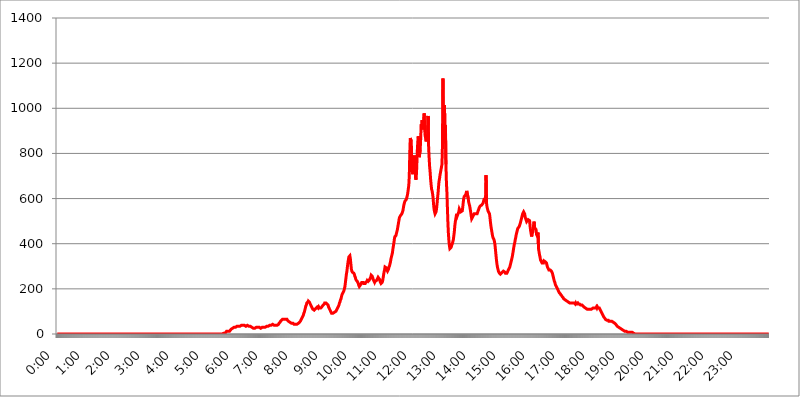
| Category | 2015.04.28. Intenzitás [W/m^2] |
|---|---|
| 0.0 | 0 |
| 0.0006944444444444445 | 0 |
| 0.001388888888888889 | 0 |
| 0.0020833333333333333 | 0 |
| 0.002777777777777778 | 0 |
| 0.003472222222222222 | 0 |
| 0.004166666666666667 | 0 |
| 0.004861111111111111 | 0 |
| 0.005555555555555556 | 0 |
| 0.0062499999999999995 | 0 |
| 0.006944444444444444 | 0 |
| 0.007638888888888889 | 0 |
| 0.008333333333333333 | 0 |
| 0.009027777777777779 | 0 |
| 0.009722222222222222 | 0 |
| 0.010416666666666666 | 0 |
| 0.011111111111111112 | 0 |
| 0.011805555555555555 | 0 |
| 0.012499999999999999 | 0 |
| 0.013194444444444444 | 0 |
| 0.013888888888888888 | 0 |
| 0.014583333333333332 | 0 |
| 0.015277777777777777 | 0 |
| 0.015972222222222224 | 0 |
| 0.016666666666666666 | 0 |
| 0.017361111111111112 | 0 |
| 0.018055555555555557 | 0 |
| 0.01875 | 0 |
| 0.019444444444444445 | 0 |
| 0.02013888888888889 | 0 |
| 0.020833333333333332 | 0 |
| 0.02152777777777778 | 0 |
| 0.022222222222222223 | 0 |
| 0.02291666666666667 | 0 |
| 0.02361111111111111 | 0 |
| 0.024305555555555556 | 0 |
| 0.024999999999999998 | 0 |
| 0.025694444444444447 | 0 |
| 0.02638888888888889 | 0 |
| 0.027083333333333334 | 0 |
| 0.027777777777777776 | 0 |
| 0.02847222222222222 | 0 |
| 0.029166666666666664 | 0 |
| 0.029861111111111113 | 0 |
| 0.030555555555555555 | 0 |
| 0.03125 | 0 |
| 0.03194444444444445 | 0 |
| 0.03263888888888889 | 0 |
| 0.03333333333333333 | 0 |
| 0.034027777777777775 | 0 |
| 0.034722222222222224 | 0 |
| 0.035416666666666666 | 0 |
| 0.036111111111111115 | 0 |
| 0.03680555555555556 | 0 |
| 0.0375 | 0 |
| 0.03819444444444444 | 0 |
| 0.03888888888888889 | 0 |
| 0.03958333333333333 | 0 |
| 0.04027777777777778 | 0 |
| 0.04097222222222222 | 0 |
| 0.041666666666666664 | 0 |
| 0.042361111111111106 | 0 |
| 0.04305555555555556 | 0 |
| 0.043750000000000004 | 0 |
| 0.044444444444444446 | 0 |
| 0.04513888888888889 | 0 |
| 0.04583333333333334 | 0 |
| 0.04652777777777778 | 0 |
| 0.04722222222222222 | 0 |
| 0.04791666666666666 | 0 |
| 0.04861111111111111 | 0 |
| 0.049305555555555554 | 0 |
| 0.049999999999999996 | 0 |
| 0.05069444444444445 | 0 |
| 0.051388888888888894 | 0 |
| 0.052083333333333336 | 0 |
| 0.05277777777777778 | 0 |
| 0.05347222222222222 | 0 |
| 0.05416666666666667 | 0 |
| 0.05486111111111111 | 0 |
| 0.05555555555555555 | 0 |
| 0.05625 | 0 |
| 0.05694444444444444 | 0 |
| 0.057638888888888885 | 0 |
| 0.05833333333333333 | 0 |
| 0.05902777777777778 | 0 |
| 0.059722222222222225 | 0 |
| 0.06041666666666667 | 0 |
| 0.061111111111111116 | 0 |
| 0.06180555555555556 | 0 |
| 0.0625 | 0 |
| 0.06319444444444444 | 0 |
| 0.06388888888888888 | 0 |
| 0.06458333333333334 | 0 |
| 0.06527777777777778 | 0 |
| 0.06597222222222222 | 0 |
| 0.06666666666666667 | 0 |
| 0.06736111111111111 | 0 |
| 0.06805555555555555 | 0 |
| 0.06874999999999999 | 0 |
| 0.06944444444444443 | 0 |
| 0.07013888888888889 | 0 |
| 0.07083333333333333 | 0 |
| 0.07152777777777779 | 0 |
| 0.07222222222222223 | 0 |
| 0.07291666666666667 | 0 |
| 0.07361111111111111 | 0 |
| 0.07430555555555556 | 0 |
| 0.075 | 0 |
| 0.07569444444444444 | 0 |
| 0.0763888888888889 | 0 |
| 0.07708333333333334 | 0 |
| 0.07777777777777778 | 0 |
| 0.07847222222222222 | 0 |
| 0.07916666666666666 | 0 |
| 0.0798611111111111 | 0 |
| 0.08055555555555556 | 0 |
| 0.08125 | 0 |
| 0.08194444444444444 | 0 |
| 0.08263888888888889 | 0 |
| 0.08333333333333333 | 0 |
| 0.08402777777777777 | 0 |
| 0.08472222222222221 | 0 |
| 0.08541666666666665 | 0 |
| 0.08611111111111112 | 0 |
| 0.08680555555555557 | 0 |
| 0.08750000000000001 | 0 |
| 0.08819444444444445 | 0 |
| 0.08888888888888889 | 0 |
| 0.08958333333333333 | 0 |
| 0.09027777777777778 | 0 |
| 0.09097222222222222 | 0 |
| 0.09166666666666667 | 0 |
| 0.09236111111111112 | 0 |
| 0.09305555555555556 | 0 |
| 0.09375 | 0 |
| 0.09444444444444444 | 0 |
| 0.09513888888888888 | 0 |
| 0.09583333333333333 | 0 |
| 0.09652777777777777 | 0 |
| 0.09722222222222222 | 0 |
| 0.09791666666666667 | 0 |
| 0.09861111111111111 | 0 |
| 0.09930555555555555 | 0 |
| 0.09999999999999999 | 0 |
| 0.10069444444444443 | 0 |
| 0.1013888888888889 | 0 |
| 0.10208333333333335 | 0 |
| 0.10277777777777779 | 0 |
| 0.10347222222222223 | 0 |
| 0.10416666666666667 | 0 |
| 0.10486111111111111 | 0 |
| 0.10555555555555556 | 0 |
| 0.10625 | 0 |
| 0.10694444444444444 | 0 |
| 0.1076388888888889 | 0 |
| 0.10833333333333334 | 0 |
| 0.10902777777777778 | 0 |
| 0.10972222222222222 | 0 |
| 0.1111111111111111 | 0 |
| 0.11180555555555556 | 0 |
| 0.11180555555555556 | 0 |
| 0.1125 | 0 |
| 0.11319444444444444 | 0 |
| 0.11388888888888889 | 0 |
| 0.11458333333333333 | 0 |
| 0.11527777777777777 | 0 |
| 0.11597222222222221 | 0 |
| 0.11666666666666665 | 0 |
| 0.1173611111111111 | 0 |
| 0.11805555555555557 | 0 |
| 0.11944444444444445 | 0 |
| 0.12013888888888889 | 0 |
| 0.12083333333333333 | 0 |
| 0.12152777777777778 | 0 |
| 0.12222222222222223 | 0 |
| 0.12291666666666667 | 0 |
| 0.12291666666666667 | 0 |
| 0.12361111111111112 | 0 |
| 0.12430555555555556 | 0 |
| 0.125 | 0 |
| 0.12569444444444444 | 0 |
| 0.12638888888888888 | 0 |
| 0.12708333333333333 | 0 |
| 0.16875 | 0 |
| 0.12847222222222224 | 0 |
| 0.12916666666666668 | 0 |
| 0.12986111111111112 | 0 |
| 0.13055555555555556 | 0 |
| 0.13125 | 0 |
| 0.13194444444444445 | 0 |
| 0.1326388888888889 | 0 |
| 0.13333333333333333 | 0 |
| 0.13402777777777777 | 0 |
| 0.13402777777777777 | 0 |
| 0.13472222222222222 | 0 |
| 0.13541666666666666 | 0 |
| 0.1361111111111111 | 0 |
| 0.13749999999999998 | 0 |
| 0.13819444444444443 | 0 |
| 0.1388888888888889 | 0 |
| 0.13958333333333334 | 0 |
| 0.14027777777777778 | 0 |
| 0.14097222222222222 | 0 |
| 0.14166666666666666 | 0 |
| 0.1423611111111111 | 0 |
| 0.14305555555555557 | 0 |
| 0.14375000000000002 | 0 |
| 0.14444444444444446 | 0 |
| 0.1451388888888889 | 0 |
| 0.1451388888888889 | 0 |
| 0.14652777777777778 | 0 |
| 0.14722222222222223 | 0 |
| 0.14791666666666667 | 0 |
| 0.1486111111111111 | 0 |
| 0.14930555555555555 | 0 |
| 0.15 | 0 |
| 0.15069444444444444 | 0 |
| 0.15138888888888888 | 0 |
| 0.15208333333333332 | 0 |
| 0.15277777777777776 | 0 |
| 0.15347222222222223 | 0 |
| 0.15416666666666667 | 0 |
| 0.15486111111111112 | 0 |
| 0.15555555555555556 | 0 |
| 0.15625 | 0 |
| 0.15694444444444444 | 0 |
| 0.15763888888888888 | 0 |
| 0.15833333333333333 | 0 |
| 0.15902777777777777 | 0 |
| 0.15972222222222224 | 0 |
| 0.16041666666666668 | 0 |
| 0.16111111111111112 | 0 |
| 0.16180555555555556 | 0 |
| 0.1625 | 0 |
| 0.16319444444444445 | 0 |
| 0.1638888888888889 | 0 |
| 0.16458333333333333 | 0 |
| 0.16527777777777777 | 0 |
| 0.16597222222222222 | 0 |
| 0.16666666666666666 | 0 |
| 0.1673611111111111 | 0 |
| 0.16805555555555554 | 0 |
| 0.16874999999999998 | 0 |
| 0.16944444444444443 | 0 |
| 0.17013888888888887 | 0 |
| 0.1708333333333333 | 0 |
| 0.17152777777777775 | 0 |
| 0.17222222222222225 | 0 |
| 0.1729166666666667 | 0 |
| 0.17361111111111113 | 0 |
| 0.17430555555555557 | 0 |
| 0.17500000000000002 | 0 |
| 0.17569444444444446 | 0 |
| 0.1763888888888889 | 0 |
| 0.17708333333333334 | 0 |
| 0.17777777777777778 | 0 |
| 0.17847222222222223 | 0 |
| 0.17916666666666667 | 0 |
| 0.1798611111111111 | 0 |
| 0.18055555555555555 | 0 |
| 0.18125 | 0 |
| 0.18194444444444444 | 0 |
| 0.1826388888888889 | 0 |
| 0.18333333333333335 | 0 |
| 0.1840277777777778 | 0 |
| 0.18472222222222223 | 0 |
| 0.18541666666666667 | 0 |
| 0.18611111111111112 | 0 |
| 0.18680555555555556 | 0 |
| 0.1875 | 0 |
| 0.18819444444444444 | 0 |
| 0.18888888888888888 | 0 |
| 0.18958333333333333 | 0 |
| 0.19027777777777777 | 0 |
| 0.1909722222222222 | 0 |
| 0.19166666666666665 | 0 |
| 0.19236111111111112 | 0 |
| 0.19305555555555554 | 0 |
| 0.19375 | 0 |
| 0.19444444444444445 | 0 |
| 0.1951388888888889 | 0 |
| 0.19583333333333333 | 0 |
| 0.19652777777777777 | 0 |
| 0.19722222222222222 | 0 |
| 0.19791666666666666 | 0 |
| 0.1986111111111111 | 0 |
| 0.19930555555555554 | 0 |
| 0.19999999999999998 | 0 |
| 0.20069444444444443 | 0 |
| 0.20138888888888887 | 0 |
| 0.2020833333333333 | 0 |
| 0.2027777777777778 | 0 |
| 0.2034722222222222 | 0 |
| 0.2041666666666667 | 0 |
| 0.20486111111111113 | 0 |
| 0.20555555555555557 | 0 |
| 0.20625000000000002 | 0 |
| 0.20694444444444446 | 0 |
| 0.2076388888888889 | 0 |
| 0.20833333333333334 | 0 |
| 0.20902777777777778 | 0 |
| 0.20972222222222223 | 0 |
| 0.21041666666666667 | 0 |
| 0.2111111111111111 | 0 |
| 0.21180555555555555 | 0 |
| 0.2125 | 0 |
| 0.21319444444444444 | 0 |
| 0.2138888888888889 | 0 |
| 0.21458333333333335 | 0 |
| 0.2152777777777778 | 0 |
| 0.21597222222222223 | 0 |
| 0.21666666666666667 | 0 |
| 0.21736111111111112 | 0 |
| 0.21805555555555556 | 0 |
| 0.21875 | 0 |
| 0.21944444444444444 | 0 |
| 0.22013888888888888 | 0 |
| 0.22083333333333333 | 0 |
| 0.22152777777777777 | 0 |
| 0.2222222222222222 | 0 |
| 0.22291666666666665 | 0 |
| 0.2236111111111111 | 0 |
| 0.22430555555555556 | 0 |
| 0.225 | 0 |
| 0.22569444444444445 | 0 |
| 0.2263888888888889 | 0 |
| 0.22708333333333333 | 0 |
| 0.22777777777777777 | 0 |
| 0.22847222222222222 | 0 |
| 0.22916666666666666 | 0 |
| 0.2298611111111111 | 0 |
| 0.23055555555555554 | 0 |
| 0.23124999999999998 | 0 |
| 0.23194444444444443 | 3.525 |
| 0.23263888888888887 | 3.525 |
| 0.2333333333333333 | 3.525 |
| 0.2340277777777778 | 3.525 |
| 0.2347222222222222 | 3.525 |
| 0.2354166666666667 | 3.525 |
| 0.23611111111111113 | 7.887 |
| 0.23680555555555557 | 7.887 |
| 0.23750000000000002 | 12.257 |
| 0.23819444444444446 | 12.257 |
| 0.2388888888888889 | 12.257 |
| 0.23958333333333334 | 12.257 |
| 0.24027777777777778 | 12.257 |
| 0.24097222222222223 | 12.257 |
| 0.24166666666666667 | 12.257 |
| 0.2423611111111111 | 16.636 |
| 0.24305555555555555 | 16.636 |
| 0.24375 | 21.024 |
| 0.24444444444444446 | 21.024 |
| 0.24513888888888888 | 21.024 |
| 0.24583333333333335 | 25.419 |
| 0.2465277777777778 | 25.419 |
| 0.24722222222222223 | 29.823 |
| 0.24791666666666667 | 29.823 |
| 0.24861111111111112 | 29.823 |
| 0.24930555555555556 | 29.823 |
| 0.25 | 29.823 |
| 0.25069444444444444 | 34.234 |
| 0.2513888888888889 | 34.234 |
| 0.2520833333333333 | 34.234 |
| 0.25277777777777777 | 34.234 |
| 0.2534722222222222 | 34.234 |
| 0.25416666666666665 | 34.234 |
| 0.2548611111111111 | 34.234 |
| 0.2555555555555556 | 34.234 |
| 0.25625000000000003 | 34.234 |
| 0.2569444444444445 | 38.653 |
| 0.2576388888888889 | 38.653 |
| 0.25833333333333336 | 38.653 |
| 0.2590277777777778 | 38.653 |
| 0.25972222222222224 | 38.653 |
| 0.2604166666666667 | 38.653 |
| 0.2611111111111111 | 38.653 |
| 0.26180555555555557 | 38.653 |
| 0.2625 | 38.653 |
| 0.26319444444444445 | 38.653 |
| 0.2638888888888889 | 34.234 |
| 0.26458333333333334 | 34.234 |
| 0.2652777777777778 | 34.234 |
| 0.2659722222222222 | 38.653 |
| 0.26666666666666666 | 38.653 |
| 0.2673611111111111 | 38.653 |
| 0.26805555555555555 | 38.653 |
| 0.26875 | 34.234 |
| 0.26944444444444443 | 34.234 |
| 0.2701388888888889 | 34.234 |
| 0.2708333333333333 | 34.234 |
| 0.27152777777777776 | 29.823 |
| 0.2722222222222222 | 29.823 |
| 0.27291666666666664 | 29.823 |
| 0.2736111111111111 | 29.823 |
| 0.2743055555555555 | 29.823 |
| 0.27499999999999997 | 25.419 |
| 0.27569444444444446 | 25.419 |
| 0.27638888888888885 | 25.419 |
| 0.27708333333333335 | 25.419 |
| 0.2777777777777778 | 25.419 |
| 0.27847222222222223 | 29.823 |
| 0.2791666666666667 | 29.823 |
| 0.2798611111111111 | 29.823 |
| 0.28055555555555556 | 29.823 |
| 0.28125 | 29.823 |
| 0.28194444444444444 | 29.823 |
| 0.2826388888888889 | 29.823 |
| 0.2833333333333333 | 29.823 |
| 0.28402777777777777 | 29.823 |
| 0.2847222222222222 | 25.419 |
| 0.28541666666666665 | 25.419 |
| 0.28611111111111115 | 29.823 |
| 0.28680555555555554 | 29.823 |
| 0.28750000000000003 | 29.823 |
| 0.2881944444444445 | 29.823 |
| 0.2888888888888889 | 29.823 |
| 0.28958333333333336 | 29.823 |
| 0.2902777777777778 | 29.823 |
| 0.29097222222222224 | 29.823 |
| 0.2916666666666667 | 29.823 |
| 0.2923611111111111 | 29.823 |
| 0.29305555555555557 | 29.823 |
| 0.29375 | 34.234 |
| 0.29444444444444445 | 34.234 |
| 0.2951388888888889 | 34.234 |
| 0.29583333333333334 | 34.234 |
| 0.2965277777777778 | 38.653 |
| 0.2972222222222222 | 38.653 |
| 0.29791666666666666 | 38.653 |
| 0.2986111111111111 | 38.653 |
| 0.29930555555555555 | 38.653 |
| 0.3 | 38.653 |
| 0.30069444444444443 | 43.079 |
| 0.3013888888888889 | 43.079 |
| 0.3020833333333333 | 43.079 |
| 0.30277777777777776 | 43.079 |
| 0.3034722222222222 | 43.079 |
| 0.30416666666666664 | 38.653 |
| 0.3048611111111111 | 38.653 |
| 0.3055555555555555 | 38.653 |
| 0.30624999999999997 | 38.653 |
| 0.3069444444444444 | 38.653 |
| 0.3076388888888889 | 38.653 |
| 0.30833333333333335 | 38.653 |
| 0.3090277777777778 | 38.653 |
| 0.30972222222222223 | 38.653 |
| 0.3104166666666667 | 43.079 |
| 0.3111111111111111 | 47.511 |
| 0.31180555555555556 | 47.511 |
| 0.3125 | 51.951 |
| 0.31319444444444444 | 56.398 |
| 0.3138888888888889 | 56.398 |
| 0.3145833333333333 | 60.85 |
| 0.31527777777777777 | 60.85 |
| 0.3159722222222222 | 65.31 |
| 0.31666666666666665 | 65.31 |
| 0.31736111111111115 | 65.31 |
| 0.31805555555555554 | 65.31 |
| 0.31875000000000003 | 65.31 |
| 0.3194444444444445 | 65.31 |
| 0.3201388888888889 | 65.31 |
| 0.32083333333333336 | 65.31 |
| 0.3215277777777778 | 65.31 |
| 0.32222222222222224 | 65.31 |
| 0.3229166666666667 | 60.85 |
| 0.3236111111111111 | 60.85 |
| 0.32430555555555557 | 56.398 |
| 0.325 | 56.398 |
| 0.32569444444444445 | 56.398 |
| 0.3263888888888889 | 51.951 |
| 0.32708333333333334 | 51.951 |
| 0.3277777777777778 | 51.951 |
| 0.3284722222222222 | 47.511 |
| 0.32916666666666666 | 47.511 |
| 0.3298611111111111 | 47.511 |
| 0.33055555555555555 | 47.511 |
| 0.33125 | 47.511 |
| 0.33194444444444443 | 43.079 |
| 0.3326388888888889 | 43.079 |
| 0.3333333333333333 | 43.079 |
| 0.3340277777777778 | 43.079 |
| 0.3347222222222222 | 43.079 |
| 0.3354166666666667 | 43.079 |
| 0.3361111111111111 | 43.079 |
| 0.3368055555555556 | 43.079 |
| 0.33749999999999997 | 43.079 |
| 0.33819444444444446 | 47.511 |
| 0.33888888888888885 | 47.511 |
| 0.33958333333333335 | 51.951 |
| 0.34027777777777773 | 51.951 |
| 0.34097222222222223 | 56.398 |
| 0.3416666666666666 | 60.85 |
| 0.3423611111111111 | 65.31 |
| 0.3430555555555555 | 69.775 |
| 0.34375 | 74.246 |
| 0.3444444444444445 | 78.722 |
| 0.3451388888888889 | 83.205 |
| 0.3458333333333334 | 92.184 |
| 0.34652777777777777 | 96.682 |
| 0.34722222222222227 | 105.69 |
| 0.34791666666666665 | 114.716 |
| 0.34861111111111115 | 123.758 |
| 0.34930555555555554 | 128.284 |
| 0.35000000000000003 | 137.347 |
| 0.3506944444444444 | 137.347 |
| 0.3513888888888889 | 141.884 |
| 0.3520833333333333 | 146.423 |
| 0.3527777777777778 | 146.423 |
| 0.3534722222222222 | 141.884 |
| 0.3541666666666667 | 137.347 |
| 0.3548611111111111 | 132.814 |
| 0.35555555555555557 | 128.284 |
| 0.35625 | 123.758 |
| 0.35694444444444445 | 119.235 |
| 0.3576388888888889 | 114.716 |
| 0.35833333333333334 | 110.201 |
| 0.3590277777777778 | 110.201 |
| 0.3597222222222222 | 110.201 |
| 0.36041666666666666 | 105.69 |
| 0.3611111111111111 | 105.69 |
| 0.36180555555555555 | 110.201 |
| 0.3625 | 110.201 |
| 0.36319444444444443 | 114.716 |
| 0.3638888888888889 | 114.716 |
| 0.3645833333333333 | 119.235 |
| 0.3652777777777778 | 119.235 |
| 0.3659722222222222 | 114.716 |
| 0.3666666666666667 | 119.235 |
| 0.3673611111111111 | 114.716 |
| 0.3680555555555556 | 114.716 |
| 0.36874999999999997 | 114.716 |
| 0.36944444444444446 | 114.716 |
| 0.37013888888888885 | 114.716 |
| 0.37083333333333335 | 119.235 |
| 0.37152777777777773 | 119.235 |
| 0.37222222222222223 | 119.235 |
| 0.3729166666666666 | 128.284 |
| 0.3736111111111111 | 128.284 |
| 0.3743055555555555 | 132.814 |
| 0.375 | 137.347 |
| 0.3756944444444445 | 137.347 |
| 0.3763888888888889 | 137.347 |
| 0.3770833333333334 | 137.347 |
| 0.37777777777777777 | 137.347 |
| 0.37847222222222227 | 132.814 |
| 0.37916666666666665 | 132.814 |
| 0.37986111111111115 | 128.284 |
| 0.38055555555555554 | 119.235 |
| 0.38125000000000003 | 114.716 |
| 0.3819444444444444 | 110.201 |
| 0.3826388888888889 | 105.69 |
| 0.3833333333333333 | 101.184 |
| 0.3840277777777778 | 96.682 |
| 0.3847222222222222 | 92.184 |
| 0.3854166666666667 | 92.184 |
| 0.3861111111111111 | 92.184 |
| 0.38680555555555557 | 92.184 |
| 0.3875 | 92.184 |
| 0.38819444444444445 | 92.184 |
| 0.3888888888888889 | 96.682 |
| 0.38958333333333334 | 96.682 |
| 0.3902777777777778 | 96.682 |
| 0.3909722222222222 | 101.184 |
| 0.39166666666666666 | 105.69 |
| 0.3923611111111111 | 110.201 |
| 0.39305555555555555 | 114.716 |
| 0.39375 | 119.235 |
| 0.39444444444444443 | 123.758 |
| 0.3951388888888889 | 128.284 |
| 0.3958333333333333 | 137.347 |
| 0.3965277777777778 | 141.884 |
| 0.3972222222222222 | 150.964 |
| 0.3979166666666667 | 155.509 |
| 0.3986111111111111 | 164.605 |
| 0.3993055555555556 | 173.709 |
| 0.39999999999999997 | 178.264 |
| 0.40069444444444446 | 182.82 |
| 0.40138888888888885 | 187.378 |
| 0.40208333333333335 | 191.937 |
| 0.40277777777777773 | 201.058 |
| 0.40347222222222223 | 210.182 |
| 0.4041666666666666 | 228.436 |
| 0.4048611111111111 | 246.689 |
| 0.4055555555555555 | 264.932 |
| 0.40625 | 278.603 |
| 0.4069444444444445 | 296.808 |
| 0.4076388888888889 | 314.98 |
| 0.4083333333333334 | 328.584 |
| 0.40902777777777777 | 342.162 |
| 0.40972222222222227 | 342.162 |
| 0.41041666666666665 | 346.682 |
| 0.41111111111111115 | 333.113 |
| 0.41180555555555554 | 310.44 |
| 0.41250000000000003 | 287.709 |
| 0.4131944444444444 | 278.603 |
| 0.4138888888888889 | 274.047 |
| 0.4145833333333333 | 274.047 |
| 0.4152777777777778 | 274.047 |
| 0.4159722222222222 | 269.49 |
| 0.4166666666666667 | 264.932 |
| 0.4173611111111111 | 255.813 |
| 0.41805555555555557 | 251.251 |
| 0.41875 | 242.127 |
| 0.41944444444444445 | 237.564 |
| 0.4201388888888889 | 237.564 |
| 0.42083333333333334 | 233 |
| 0.4215277777777778 | 228.436 |
| 0.4222222222222222 | 223.873 |
| 0.42291666666666666 | 214.746 |
| 0.4236111111111111 | 210.182 |
| 0.42430555555555555 | 210.182 |
| 0.425 | 210.182 |
| 0.42569444444444443 | 219.309 |
| 0.4263888888888889 | 223.873 |
| 0.4270833333333333 | 228.436 |
| 0.4277777777777778 | 228.436 |
| 0.4284722222222222 | 228.436 |
| 0.4291666666666667 | 228.436 |
| 0.4298611111111111 | 223.873 |
| 0.4305555555555556 | 223.873 |
| 0.43124999999999997 | 223.873 |
| 0.43194444444444446 | 223.873 |
| 0.43263888888888885 | 228.436 |
| 0.43333333333333335 | 228.436 |
| 0.43402777777777773 | 233 |
| 0.43472222222222223 | 237.564 |
| 0.4354166666666666 | 237.564 |
| 0.4361111111111111 | 233 |
| 0.4368055555555555 | 233 |
| 0.4375 | 237.564 |
| 0.4381944444444445 | 242.127 |
| 0.4388888888888889 | 246.689 |
| 0.4395833333333334 | 251.251 |
| 0.44027777777777777 | 260.373 |
| 0.44097222222222227 | 260.373 |
| 0.44166666666666665 | 255.813 |
| 0.44236111111111115 | 251.251 |
| 0.44305555555555554 | 242.127 |
| 0.44375000000000003 | 237.564 |
| 0.4444444444444444 | 233 |
| 0.4451388888888889 | 228.436 |
| 0.4458333333333333 | 233 |
| 0.4465277777777778 | 233 |
| 0.4472222222222222 | 233 |
| 0.4479166666666667 | 237.564 |
| 0.4486111111111111 | 242.127 |
| 0.44930555555555557 | 246.689 |
| 0.45 | 251.251 |
| 0.45069444444444445 | 251.251 |
| 0.4513888888888889 | 251.251 |
| 0.45208333333333334 | 242.127 |
| 0.4527777777777778 | 233 |
| 0.4534722222222222 | 228.436 |
| 0.45416666666666666 | 223.873 |
| 0.4548611111111111 | 223.873 |
| 0.45555555555555555 | 228.436 |
| 0.45625 | 233 |
| 0.45694444444444443 | 246.689 |
| 0.4576388888888889 | 260.373 |
| 0.4583333333333333 | 274.047 |
| 0.4590277777777778 | 283.156 |
| 0.4597222222222222 | 296.808 |
| 0.4604166666666667 | 296.808 |
| 0.4611111111111111 | 296.808 |
| 0.4618055555555556 | 292.259 |
| 0.46249999999999997 | 283.156 |
| 0.46319444444444446 | 278.603 |
| 0.46388888888888885 | 283.156 |
| 0.46458333333333335 | 287.709 |
| 0.46527777777777773 | 296.808 |
| 0.46597222222222223 | 301.354 |
| 0.4666666666666666 | 310.44 |
| 0.4673611111111111 | 319.517 |
| 0.4680555555555555 | 333.113 |
| 0.46875 | 342.162 |
| 0.4694444444444445 | 351.198 |
| 0.4701388888888889 | 360.221 |
| 0.4708333333333334 | 378.224 |
| 0.47152777777777777 | 391.685 |
| 0.47222222222222227 | 405.108 |
| 0.47291666666666665 | 422.943 |
| 0.47361111111111115 | 431.833 |
| 0.47430555555555554 | 431.833 |
| 0.47500000000000003 | 436.27 |
| 0.4756944444444444 | 445.129 |
| 0.4763888888888889 | 453.968 |
| 0.4770833333333333 | 462.786 |
| 0.4777777777777778 | 475.972 |
| 0.4784722222222222 | 489.108 |
| 0.4791666666666667 | 502.192 |
| 0.4798611111111111 | 515.223 |
| 0.48055555555555557 | 519.555 |
| 0.48125 | 523.88 |
| 0.48194444444444445 | 523.88 |
| 0.4826388888888889 | 523.88 |
| 0.48333333333333334 | 532.513 |
| 0.4840277777777778 | 536.82 |
| 0.4847222222222222 | 545.416 |
| 0.48541666666666666 | 558.261 |
| 0.4861111111111111 | 571.049 |
| 0.48680555555555555 | 575.299 |
| 0.4875 | 588.009 |
| 0.48819444444444443 | 588.009 |
| 0.4888888888888889 | 592.233 |
| 0.4895833333333333 | 596.45 |
| 0.4902777777777778 | 604.864 |
| 0.4909722222222222 | 613.252 |
| 0.4916666666666667 | 625.784 |
| 0.4923611111111111 | 642.4 |
| 0.4930555555555556 | 658.909 |
| 0.49374999999999997 | 699.717 |
| 0.49444444444444446 | 802.868 |
| 0.49513888888888885 | 868.305 |
| 0.49583333333333335 | 868.305 |
| 0.49652777777777773 | 853.029 |
| 0.49722222222222223 | 767.62 |
| 0.4979166666666666 | 719.877 |
| 0.4986111111111111 | 707.8 |
| 0.4993055555555555 | 703.762 |
| 0.5 | 743.859 |
| 0.5006944444444444 | 791.169 |
| 0.5013888888888889 | 791.169 |
| 0.5020833333333333 | 719.877 |
| 0.5027777777777778 | 683.473 |
| 0.5034722222222222 | 691.608 |
| 0.5041666666666667 | 735.89 |
| 0.5048611111111111 | 802.868 |
| 0.5055555555555555 | 845.365 |
| 0.50625 | 875.918 |
| 0.5069444444444444 | 860.676 |
| 0.5076388888888889 | 783.342 |
| 0.5083333333333333 | 783.342 |
| 0.5090277777777777 | 814.519 |
| 0.5097222222222222 | 864.493 |
| 0.5104166666666666 | 928.819 |
| 0.5111111111111112 | 917.534 |
| 0.5118055555555555 | 947.58 |
| 0.5125000000000001 | 940.082 |
| 0.5131944444444444 | 906.223 |
| 0.513888888888889 | 947.58 |
| 0.5145833333333333 | 977.508 |
| 0.5152777777777778 | 909.996 |
| 0.5159722222222222 | 879.719 |
| 0.5166666666666667 | 879.719 |
| 0.517361111111111 | 853.029 |
| 0.5180555555555556 | 856.855 |
| 0.5187499999999999 | 883.516 |
| 0.5194444444444445 | 875.918 |
| 0.5201388888888888 | 966.295 |
| 0.5208333333333334 | 833.834 |
| 0.5215277777777778 | 783.342 |
| 0.5222222222222223 | 743.859 |
| 0.5229166666666667 | 719.877 |
| 0.5236111111111111 | 687.544 |
| 0.5243055555555556 | 663.019 |
| 0.525 | 642.4 |
| 0.5256944444444445 | 634.105 |
| 0.5263888888888889 | 621.613 |
| 0.5270833333333333 | 604.864 |
| 0.5277777777777778 | 575.299 |
| 0.5284722222222222 | 553.986 |
| 0.5291666666666667 | 541.121 |
| 0.5298611111111111 | 532.513 |
| 0.5305555555555556 | 532.513 |
| 0.53125 | 541.121 |
| 0.5319444444444444 | 553.986 |
| 0.5326388888888889 | 575.299 |
| 0.5333333333333333 | 600.661 |
| 0.5340277777777778 | 621.613 |
| 0.5347222222222222 | 650.667 |
| 0.5354166666666667 | 675.311 |
| 0.5361111111111111 | 687.544 |
| 0.5368055555555555 | 703.762 |
| 0.5375 | 703.762 |
| 0.5381944444444444 | 727.896 |
| 0.5388888888888889 | 727.896 |
| 0.5395833333333333 | 751.803 |
| 0.5402777777777777 | 833.834 |
| 0.5409722222222222 | 1131.708 |
| 0.5416666666666666 | 845.365 |
| 0.5423611111111112 | 879.719 |
| 0.5430555555555555 | 1014.852 |
| 0.5437500000000001 | 913.766 |
| 0.5444444444444444 | 925.06 |
| 0.545138888888889 | 751.803 |
| 0.5458333333333333 | 671.22 |
| 0.5465277777777778 | 625.784 |
| 0.5472222222222222 | 558.261 |
| 0.5479166666666667 | 493.475 |
| 0.548611111111111 | 445.129 |
| 0.5493055555555556 | 414.035 |
| 0.5499999999999999 | 391.685 |
| 0.5506944444444445 | 378.224 |
| 0.5513888888888888 | 378.224 |
| 0.5520833333333334 | 382.715 |
| 0.5527777777777778 | 387.202 |
| 0.5534722222222223 | 396.164 |
| 0.5541666666666667 | 400.638 |
| 0.5548611111111111 | 409.574 |
| 0.5555555555555556 | 418.492 |
| 0.55625 | 436.27 |
| 0.5569444444444445 | 453.968 |
| 0.5576388888888889 | 480.356 |
| 0.5583333333333333 | 497.836 |
| 0.5590277777777778 | 510.885 |
| 0.5597222222222222 | 523.88 |
| 0.5604166666666667 | 532.513 |
| 0.5611111111111111 | 523.88 |
| 0.5618055555555556 | 519.555 |
| 0.5625 | 528.2 |
| 0.5631944444444444 | 541.121 |
| 0.5638888888888889 | 553.986 |
| 0.5645833333333333 | 553.986 |
| 0.5652777777777778 | 549.704 |
| 0.5659722222222222 | 541.121 |
| 0.5666666666666667 | 536.82 |
| 0.5673611111111111 | 536.82 |
| 0.5680555555555555 | 545.416 |
| 0.56875 | 562.53 |
| 0.5694444444444444 | 583.779 |
| 0.5701388888888889 | 600.661 |
| 0.5708333333333333 | 609.062 |
| 0.5715277777777777 | 609.062 |
| 0.5722222222222222 | 609.062 |
| 0.5729166666666666 | 617.436 |
| 0.5736111111111112 | 625.784 |
| 0.5743055555555555 | 634.105 |
| 0.5750000000000001 | 629.948 |
| 0.5756944444444444 | 638.256 |
| 0.576388888888889 | 600.661 |
| 0.5770833333333333 | 583.779 |
| 0.5777777777777778 | 575.299 |
| 0.5784722222222222 | 566.793 |
| 0.5791666666666667 | 553.986 |
| 0.579861111111111 | 541.121 |
| 0.5805555555555556 | 523.88 |
| 0.5812499999999999 | 510.885 |
| 0.5819444444444445 | 510.885 |
| 0.5826388888888888 | 515.223 |
| 0.5833333333333334 | 523.88 |
| 0.5840277777777778 | 528.2 |
| 0.5847222222222223 | 532.513 |
| 0.5854166666666667 | 532.513 |
| 0.5861111111111111 | 532.513 |
| 0.5868055555555556 | 532.513 |
| 0.5875 | 532.513 |
| 0.5881944444444445 | 532.513 |
| 0.5888888888888889 | 532.513 |
| 0.5895833333333333 | 536.82 |
| 0.5902777777777778 | 545.416 |
| 0.5909722222222222 | 549.704 |
| 0.5916666666666667 | 558.261 |
| 0.5923611111111111 | 562.53 |
| 0.5930555555555556 | 566.793 |
| 0.59375 | 571.049 |
| 0.5944444444444444 | 571.049 |
| 0.5951388888888889 | 571.049 |
| 0.5958333333333333 | 571.049 |
| 0.5965277777777778 | 575.299 |
| 0.5972222222222222 | 579.542 |
| 0.5979166666666667 | 588.009 |
| 0.5986111111111111 | 596.45 |
| 0.5993055555555555 | 600.661 |
| 0.6 | 596.45 |
| 0.6006944444444444 | 596.45 |
| 0.6013888888888889 | 703.762 |
| 0.6020833333333333 | 579.542 |
| 0.6027777777777777 | 562.53 |
| 0.6034722222222222 | 553.986 |
| 0.6041666666666666 | 545.416 |
| 0.6048611111111112 | 549.704 |
| 0.6055555555555555 | 545.416 |
| 0.6062500000000001 | 532.513 |
| 0.6069444444444444 | 515.223 |
| 0.607638888888889 | 493.475 |
| 0.6083333333333333 | 475.972 |
| 0.6090277777777778 | 462.786 |
| 0.6097222222222222 | 449.551 |
| 0.6104166666666667 | 436.27 |
| 0.611111111111111 | 427.39 |
| 0.6118055555555556 | 422.943 |
| 0.6124999999999999 | 418.492 |
| 0.6131944444444445 | 409.574 |
| 0.6138888888888888 | 396.164 |
| 0.6145833333333334 | 373.729 |
| 0.6152777777777778 | 351.198 |
| 0.6159722222222223 | 328.584 |
| 0.6166666666666667 | 310.44 |
| 0.6173611111111111 | 296.808 |
| 0.6180555555555556 | 287.709 |
| 0.61875 | 278.603 |
| 0.6194444444444445 | 274.047 |
| 0.6201388888888889 | 269.49 |
| 0.6208333333333333 | 269.49 |
| 0.6215277777777778 | 264.932 |
| 0.6222222222222222 | 264.932 |
| 0.6229166666666667 | 269.49 |
| 0.6236111111111111 | 269.49 |
| 0.6243055555555556 | 274.047 |
| 0.625 | 274.047 |
| 0.6256944444444444 | 278.603 |
| 0.6263888888888889 | 278.603 |
| 0.6270833333333333 | 278.603 |
| 0.6277777777777778 | 274.047 |
| 0.6284722222222222 | 269.49 |
| 0.6291666666666667 | 269.49 |
| 0.6298611111111111 | 269.49 |
| 0.6305555555555555 | 269.49 |
| 0.63125 | 274.047 |
| 0.6319444444444444 | 278.603 |
| 0.6326388888888889 | 278.603 |
| 0.6333333333333333 | 287.709 |
| 0.6340277777777777 | 287.709 |
| 0.6347222222222222 | 296.808 |
| 0.6354166666666666 | 305.898 |
| 0.6361111111111112 | 314.98 |
| 0.6368055555555555 | 324.052 |
| 0.6375000000000001 | 333.113 |
| 0.6381944444444444 | 342.162 |
| 0.638888888888889 | 355.712 |
| 0.6395833333333333 | 369.23 |
| 0.6402777777777778 | 382.715 |
| 0.6409722222222222 | 396.164 |
| 0.6416666666666667 | 405.108 |
| 0.642361111111111 | 418.492 |
| 0.6430555555555556 | 427.39 |
| 0.6437499999999999 | 440.702 |
| 0.6444444444444445 | 449.551 |
| 0.6451388888888888 | 458.38 |
| 0.6458333333333334 | 467.187 |
| 0.6465277777777778 | 471.582 |
| 0.6472222222222223 | 471.582 |
| 0.6479166666666667 | 475.972 |
| 0.6486111111111111 | 480.356 |
| 0.6493055555555556 | 489.108 |
| 0.65 | 497.836 |
| 0.6506944444444445 | 506.542 |
| 0.6513888888888889 | 515.223 |
| 0.6520833333333333 | 523.88 |
| 0.6527777777777778 | 532.513 |
| 0.6534722222222222 | 536.82 |
| 0.6541666666666667 | 541.121 |
| 0.6548611111111111 | 541.121 |
| 0.6555555555555556 | 532.513 |
| 0.65625 | 519.555 |
| 0.6569444444444444 | 510.885 |
| 0.6576388888888889 | 506.542 |
| 0.6583333333333333 | 497.836 |
| 0.6590277777777778 | 493.475 |
| 0.6597222222222222 | 497.836 |
| 0.6604166666666667 | 506.542 |
| 0.6611111111111111 | 506.542 |
| 0.6618055555555555 | 510.885 |
| 0.6625 | 502.192 |
| 0.6631944444444444 | 475.972 |
| 0.6638888888888889 | 458.38 |
| 0.6645833333333333 | 445.129 |
| 0.6652777777777777 | 431.833 |
| 0.6659722222222222 | 440.702 |
| 0.6666666666666666 | 445.129 |
| 0.6673611111111111 | 458.38 |
| 0.6680555555555556 | 480.356 |
| 0.6687500000000001 | 497.836 |
| 0.6694444444444444 | 471.582 |
| 0.6701388888888888 | 475.972 |
| 0.6708333333333334 | 475.972 |
| 0.6715277777777778 | 462.786 |
| 0.6722222222222222 | 440.702 |
| 0.6729166666666666 | 436.27 |
| 0.6736111111111112 | 431.833 |
| 0.6743055555555556 | 449.551 |
| 0.6749999999999999 | 378.224 |
| 0.6756944444444444 | 364.728 |
| 0.6763888888888889 | 351.198 |
| 0.6770833333333334 | 342.162 |
| 0.6777777777777777 | 328.584 |
| 0.6784722222222223 | 324.052 |
| 0.6791666666666667 | 319.517 |
| 0.6798611111111111 | 314.98 |
| 0.6805555555555555 | 314.98 |
| 0.68125 | 314.98 |
| 0.6819444444444445 | 314.98 |
| 0.6826388888888889 | 324.052 |
| 0.6833333333333332 | 324.052 |
| 0.6840277777777778 | 324.052 |
| 0.6847222222222222 | 319.517 |
| 0.6854166666666667 | 319.517 |
| 0.686111111111111 | 314.98 |
| 0.6868055555555556 | 305.898 |
| 0.6875 | 296.808 |
| 0.6881944444444444 | 292.259 |
| 0.688888888888889 | 287.709 |
| 0.6895833333333333 | 283.156 |
| 0.6902777777777778 | 283.156 |
| 0.6909722222222222 | 283.156 |
| 0.6916666666666668 | 283.156 |
| 0.6923611111111111 | 283.156 |
| 0.6930555555555555 | 278.603 |
| 0.69375 | 274.047 |
| 0.6944444444444445 | 269.49 |
| 0.6951388888888889 | 260.373 |
| 0.6958333333333333 | 251.251 |
| 0.6965277777777777 | 242.127 |
| 0.6972222222222223 | 233 |
| 0.6979166666666666 | 228.436 |
| 0.6986111111111111 | 219.309 |
| 0.6993055555555556 | 214.746 |
| 0.7000000000000001 | 210.182 |
| 0.7006944444444444 | 205.62 |
| 0.7013888888888888 | 201.058 |
| 0.7020833333333334 | 196.497 |
| 0.7027777777777778 | 191.937 |
| 0.7034722222222222 | 187.378 |
| 0.7041666666666666 | 182.82 |
| 0.7048611111111112 | 182.82 |
| 0.7055555555555556 | 178.264 |
| 0.7062499999999999 | 173.709 |
| 0.7069444444444444 | 173.709 |
| 0.7076388888888889 | 169.156 |
| 0.7083333333333334 | 164.605 |
| 0.7090277777777777 | 164.605 |
| 0.7097222222222223 | 160.056 |
| 0.7104166666666667 | 155.509 |
| 0.7111111111111111 | 155.509 |
| 0.7118055555555555 | 155.509 |
| 0.7125 | 150.964 |
| 0.7131944444444445 | 150.964 |
| 0.7138888888888889 | 150.964 |
| 0.7145833333333332 | 146.423 |
| 0.7152777777777778 | 146.423 |
| 0.7159722222222222 | 146.423 |
| 0.7166666666666667 | 141.884 |
| 0.717361111111111 | 141.884 |
| 0.7180555555555556 | 141.884 |
| 0.71875 | 137.347 |
| 0.7194444444444444 | 137.347 |
| 0.720138888888889 | 137.347 |
| 0.7208333333333333 | 137.347 |
| 0.7215277777777778 | 137.347 |
| 0.7222222222222222 | 137.347 |
| 0.7229166666666668 | 137.347 |
| 0.7236111111111111 | 137.347 |
| 0.7243055555555555 | 137.347 |
| 0.725 | 137.347 |
| 0.7256944444444445 | 137.347 |
| 0.7263888888888889 | 132.814 |
| 0.7270833333333333 | 137.347 |
| 0.7277777777777777 | 132.814 |
| 0.7284722222222223 | 132.814 |
| 0.7291666666666666 | 132.814 |
| 0.7298611111111111 | 137.347 |
| 0.7305555555555556 | 132.814 |
| 0.7312500000000001 | 132.814 |
| 0.7319444444444444 | 132.814 |
| 0.7326388888888888 | 132.814 |
| 0.7333333333333334 | 132.814 |
| 0.7340277777777778 | 128.284 |
| 0.7347222222222222 | 128.284 |
| 0.7354166666666666 | 128.284 |
| 0.7361111111111112 | 128.284 |
| 0.7368055555555556 | 128.284 |
| 0.7374999999999999 | 123.758 |
| 0.7381944444444444 | 123.758 |
| 0.7388888888888889 | 119.235 |
| 0.7395833333333334 | 119.235 |
| 0.7402777777777777 | 119.235 |
| 0.7409722222222223 | 114.716 |
| 0.7416666666666667 | 114.716 |
| 0.7423611111111111 | 114.716 |
| 0.7430555555555555 | 110.201 |
| 0.74375 | 110.201 |
| 0.7444444444444445 | 110.201 |
| 0.7451388888888889 | 110.201 |
| 0.7458333333333332 | 110.201 |
| 0.7465277777777778 | 110.201 |
| 0.7472222222222222 | 110.201 |
| 0.7479166666666667 | 110.201 |
| 0.748611111111111 | 110.201 |
| 0.7493055555555556 | 110.201 |
| 0.75 | 110.201 |
| 0.7506944444444444 | 110.201 |
| 0.751388888888889 | 114.716 |
| 0.7520833333333333 | 114.716 |
| 0.7527777777777778 | 114.716 |
| 0.7534722222222222 | 114.716 |
| 0.7541666666666668 | 114.716 |
| 0.7548611111111111 | 114.716 |
| 0.7555555555555555 | 114.716 |
| 0.75625 | 119.235 |
| 0.7569444444444445 | 114.716 |
| 0.7576388888888889 | 119.235 |
| 0.7583333333333333 | 114.716 |
| 0.7590277777777777 | 114.716 |
| 0.7597222222222223 | 114.716 |
| 0.7604166666666666 | 114.716 |
| 0.7611111111111111 | 110.201 |
| 0.7618055555555556 | 105.69 |
| 0.7625000000000001 | 101.184 |
| 0.7631944444444444 | 96.682 |
| 0.7638888888888888 | 92.184 |
| 0.7645833333333334 | 87.692 |
| 0.7652777777777778 | 83.205 |
| 0.7659722222222222 | 78.722 |
| 0.7666666666666666 | 74.246 |
| 0.7673611111111112 | 74.246 |
| 0.7680555555555556 | 69.775 |
| 0.7687499999999999 | 65.31 |
| 0.7694444444444444 | 65.31 |
| 0.7701388888888889 | 65.31 |
| 0.7708333333333334 | 60.85 |
| 0.7715277777777777 | 60.85 |
| 0.7722222222222223 | 60.85 |
| 0.7729166666666667 | 60.85 |
| 0.7736111111111111 | 56.398 |
| 0.7743055555555555 | 56.398 |
| 0.775 | 56.398 |
| 0.7756944444444445 | 56.398 |
| 0.7763888888888889 | 56.398 |
| 0.7770833333333332 | 56.398 |
| 0.7777777777777778 | 56.398 |
| 0.7784722222222222 | 56.398 |
| 0.7791666666666667 | 56.398 |
| 0.779861111111111 | 51.951 |
| 0.7805555555555556 | 51.951 |
| 0.78125 | 51.951 |
| 0.7819444444444444 | 47.511 |
| 0.782638888888889 | 47.511 |
| 0.7833333333333333 | 43.079 |
| 0.7840277777777778 | 43.079 |
| 0.7847222222222222 | 38.653 |
| 0.7854166666666668 | 34.234 |
| 0.7861111111111111 | 34.234 |
| 0.7868055555555555 | 29.823 |
| 0.7875 | 29.823 |
| 0.7881944444444445 | 25.419 |
| 0.7888888888888889 | 25.419 |
| 0.7895833333333333 | 25.419 |
| 0.7902777777777777 | 21.024 |
| 0.7909722222222223 | 21.024 |
| 0.7916666666666666 | 21.024 |
| 0.7923611111111111 | 21.024 |
| 0.7930555555555556 | 21.024 |
| 0.7937500000000001 | 16.636 |
| 0.7944444444444444 | 16.636 |
| 0.7951388888888888 | 16.636 |
| 0.7958333333333334 | 12.257 |
| 0.7965277777777778 | 12.257 |
| 0.7972222222222222 | 12.257 |
| 0.7979166666666666 | 12.257 |
| 0.7986111111111112 | 12.257 |
| 0.7993055555555556 | 12.257 |
| 0.7999999999999999 | 7.887 |
| 0.8006944444444444 | 12.257 |
| 0.8013888888888889 | 12.257 |
| 0.8020833333333334 | 7.887 |
| 0.8027777777777777 | 7.887 |
| 0.8034722222222223 | 7.887 |
| 0.8041666666666667 | 7.887 |
| 0.8048611111111111 | 7.887 |
| 0.8055555555555555 | 7.887 |
| 0.80625 | 7.887 |
| 0.8069444444444445 | 3.525 |
| 0.8076388888888889 | 3.525 |
| 0.8083333333333332 | 3.525 |
| 0.8090277777777778 | 0 |
| 0.8097222222222222 | 0 |
| 0.8104166666666667 | 0 |
| 0.811111111111111 | 0 |
| 0.8118055555555556 | 0 |
| 0.8125 | 0 |
| 0.8131944444444444 | 0 |
| 0.813888888888889 | 0 |
| 0.8145833333333333 | 0 |
| 0.8152777777777778 | 0 |
| 0.8159722222222222 | 0 |
| 0.8166666666666668 | 0 |
| 0.8173611111111111 | 0 |
| 0.8180555555555555 | 0 |
| 0.81875 | 0 |
| 0.8194444444444445 | 0 |
| 0.8201388888888889 | 0 |
| 0.8208333333333333 | 0 |
| 0.8215277777777777 | 0 |
| 0.8222222222222223 | 0 |
| 0.8229166666666666 | 0 |
| 0.8236111111111111 | 0 |
| 0.8243055555555556 | 0 |
| 0.8250000000000001 | 0 |
| 0.8256944444444444 | 0 |
| 0.8263888888888888 | 0 |
| 0.8270833333333334 | 0 |
| 0.8277777777777778 | 0 |
| 0.8284722222222222 | 0 |
| 0.8291666666666666 | 0 |
| 0.8298611111111112 | 0 |
| 0.8305555555555556 | 0 |
| 0.8312499999999999 | 0 |
| 0.8319444444444444 | 0 |
| 0.8326388888888889 | 0 |
| 0.8333333333333334 | 0 |
| 0.8340277777777777 | 0 |
| 0.8347222222222223 | 0 |
| 0.8354166666666667 | 0 |
| 0.8361111111111111 | 0 |
| 0.8368055555555555 | 0 |
| 0.8375 | 0 |
| 0.8381944444444445 | 0 |
| 0.8388888888888889 | 0 |
| 0.8395833333333332 | 0 |
| 0.8402777777777778 | 0 |
| 0.8409722222222222 | 0 |
| 0.8416666666666667 | 0 |
| 0.842361111111111 | 0 |
| 0.8430555555555556 | 0 |
| 0.84375 | 0 |
| 0.8444444444444444 | 0 |
| 0.845138888888889 | 0 |
| 0.8458333333333333 | 0 |
| 0.8465277777777778 | 0 |
| 0.8472222222222222 | 0 |
| 0.8479166666666668 | 0 |
| 0.8486111111111111 | 0 |
| 0.8493055555555555 | 0 |
| 0.85 | 0 |
| 0.8506944444444445 | 0 |
| 0.8513888888888889 | 0 |
| 0.8520833333333333 | 0 |
| 0.8527777777777777 | 0 |
| 0.8534722222222223 | 0 |
| 0.8541666666666666 | 0 |
| 0.8548611111111111 | 0 |
| 0.8555555555555556 | 0 |
| 0.8562500000000001 | 0 |
| 0.8569444444444444 | 0 |
| 0.8576388888888888 | 0 |
| 0.8583333333333334 | 0 |
| 0.8590277777777778 | 0 |
| 0.8597222222222222 | 0 |
| 0.8604166666666666 | 0 |
| 0.8611111111111112 | 0 |
| 0.8618055555555556 | 0 |
| 0.8624999999999999 | 0 |
| 0.8631944444444444 | 0 |
| 0.8638888888888889 | 0 |
| 0.8645833333333334 | 0 |
| 0.8652777777777777 | 0 |
| 0.8659722222222223 | 0 |
| 0.8666666666666667 | 0 |
| 0.8673611111111111 | 0 |
| 0.8680555555555555 | 0 |
| 0.86875 | 0 |
| 0.8694444444444445 | 0 |
| 0.8701388888888889 | 0 |
| 0.8708333333333332 | 0 |
| 0.8715277777777778 | 0 |
| 0.8722222222222222 | 0 |
| 0.8729166666666667 | 0 |
| 0.873611111111111 | 0 |
| 0.8743055555555556 | 0 |
| 0.875 | 0 |
| 0.8756944444444444 | 0 |
| 0.876388888888889 | 0 |
| 0.8770833333333333 | 0 |
| 0.8777777777777778 | 0 |
| 0.8784722222222222 | 0 |
| 0.8791666666666668 | 0 |
| 0.8798611111111111 | 0 |
| 0.8805555555555555 | 0 |
| 0.88125 | 0 |
| 0.8819444444444445 | 0 |
| 0.8826388888888889 | 0 |
| 0.8833333333333333 | 0 |
| 0.8840277777777777 | 0 |
| 0.8847222222222223 | 0 |
| 0.8854166666666666 | 0 |
| 0.8861111111111111 | 0 |
| 0.8868055555555556 | 0 |
| 0.8875000000000001 | 0 |
| 0.8881944444444444 | 0 |
| 0.8888888888888888 | 0 |
| 0.8895833333333334 | 0 |
| 0.8902777777777778 | 0 |
| 0.8909722222222222 | 0 |
| 0.8916666666666666 | 0 |
| 0.8923611111111112 | 0 |
| 0.8930555555555556 | 0 |
| 0.8937499999999999 | 0 |
| 0.8944444444444444 | 0 |
| 0.8951388888888889 | 0 |
| 0.8958333333333334 | 0 |
| 0.8965277777777777 | 0 |
| 0.8972222222222223 | 0 |
| 0.8979166666666667 | 0 |
| 0.8986111111111111 | 0 |
| 0.8993055555555555 | 0 |
| 0.9 | 0 |
| 0.9006944444444445 | 0 |
| 0.9013888888888889 | 0 |
| 0.9020833333333332 | 0 |
| 0.9027777777777778 | 0 |
| 0.9034722222222222 | 0 |
| 0.9041666666666667 | 0 |
| 0.904861111111111 | 0 |
| 0.9055555555555556 | 0 |
| 0.90625 | 0 |
| 0.9069444444444444 | 0 |
| 0.907638888888889 | 0 |
| 0.9083333333333333 | 0 |
| 0.9090277777777778 | 0 |
| 0.9097222222222222 | 0 |
| 0.9104166666666668 | 0 |
| 0.9111111111111111 | 0 |
| 0.9118055555555555 | 0 |
| 0.9125 | 0 |
| 0.9131944444444445 | 0 |
| 0.9138888888888889 | 0 |
| 0.9145833333333333 | 0 |
| 0.9152777777777777 | 0 |
| 0.9159722222222223 | 0 |
| 0.9166666666666666 | 0 |
| 0.9173611111111111 | 0 |
| 0.9180555555555556 | 0 |
| 0.9187500000000001 | 0 |
| 0.9194444444444444 | 0 |
| 0.9201388888888888 | 0 |
| 0.9208333333333334 | 0 |
| 0.9215277777777778 | 0 |
| 0.9222222222222222 | 0 |
| 0.9229166666666666 | 0 |
| 0.9236111111111112 | 0 |
| 0.9243055555555556 | 0 |
| 0.9249999999999999 | 0 |
| 0.9256944444444444 | 0 |
| 0.9263888888888889 | 0 |
| 0.9270833333333334 | 0 |
| 0.9277777777777777 | 0 |
| 0.9284722222222223 | 0 |
| 0.9291666666666667 | 0 |
| 0.9298611111111111 | 0 |
| 0.9305555555555555 | 0 |
| 0.93125 | 0 |
| 0.9319444444444445 | 0 |
| 0.9326388888888889 | 0 |
| 0.9333333333333332 | 0 |
| 0.9340277777777778 | 0 |
| 0.9347222222222222 | 0 |
| 0.9354166666666667 | 0 |
| 0.936111111111111 | 0 |
| 0.9368055555555556 | 0 |
| 0.9375 | 0 |
| 0.9381944444444444 | 0 |
| 0.938888888888889 | 0 |
| 0.9395833333333333 | 0 |
| 0.9402777777777778 | 0 |
| 0.9409722222222222 | 0 |
| 0.9416666666666668 | 0 |
| 0.9423611111111111 | 0 |
| 0.9430555555555555 | 0 |
| 0.94375 | 0 |
| 0.9444444444444445 | 0 |
| 0.9451388888888889 | 0 |
| 0.9458333333333333 | 0 |
| 0.9465277777777777 | 0 |
| 0.9472222222222223 | 0 |
| 0.9479166666666666 | 0 |
| 0.9486111111111111 | 0 |
| 0.9493055555555556 | 0 |
| 0.9500000000000001 | 0 |
| 0.9506944444444444 | 0 |
| 0.9513888888888888 | 0 |
| 0.9520833333333334 | 0 |
| 0.9527777777777778 | 0 |
| 0.9534722222222222 | 0 |
| 0.9541666666666666 | 0 |
| 0.9548611111111112 | 0 |
| 0.9555555555555556 | 0 |
| 0.9562499999999999 | 0 |
| 0.9569444444444444 | 0 |
| 0.9576388888888889 | 0 |
| 0.9583333333333334 | 0 |
| 0.9590277777777777 | 0 |
| 0.9597222222222223 | 0 |
| 0.9604166666666667 | 0 |
| 0.9611111111111111 | 0 |
| 0.9618055555555555 | 0 |
| 0.9625 | 0 |
| 0.9631944444444445 | 0 |
| 0.9638888888888889 | 0 |
| 0.9645833333333332 | 0 |
| 0.9652777777777778 | 0 |
| 0.9659722222222222 | 0 |
| 0.9666666666666667 | 0 |
| 0.967361111111111 | 0 |
| 0.9680555555555556 | 0 |
| 0.96875 | 0 |
| 0.9694444444444444 | 0 |
| 0.970138888888889 | 0 |
| 0.9708333333333333 | 0 |
| 0.9715277777777778 | 0 |
| 0.9722222222222222 | 0 |
| 0.9729166666666668 | 0 |
| 0.9736111111111111 | 0 |
| 0.9743055555555555 | 0 |
| 0.975 | 0 |
| 0.9756944444444445 | 0 |
| 0.9763888888888889 | 0 |
| 0.9770833333333333 | 0 |
| 0.9777777777777777 | 0 |
| 0.9784722222222223 | 0 |
| 0.9791666666666666 | 0 |
| 0.9798611111111111 | 0 |
| 0.9805555555555556 | 0 |
| 0.9812500000000001 | 0 |
| 0.9819444444444444 | 0 |
| 0.9826388888888888 | 0 |
| 0.9833333333333334 | 0 |
| 0.9840277777777778 | 0 |
| 0.9847222222222222 | 0 |
| 0.9854166666666666 | 0 |
| 0.9861111111111112 | 0 |
| 0.9868055555555556 | 0 |
| 0.9874999999999999 | 0 |
| 0.9881944444444444 | 0 |
| 0.9888888888888889 | 0 |
| 0.9895833333333334 | 0 |
| 0.9902777777777777 | 0 |
| 0.9909722222222223 | 0 |
| 0.9916666666666667 | 0 |
| 0.9923611111111111 | 0 |
| 0.9930555555555555 | 0 |
| 0.99375 | 0 |
| 0.9944444444444445 | 0 |
| 0.9951388888888889 | 0 |
| 0.9958333333333332 | 0 |
| 0.9965277777777778 | 0 |
| 0.9972222222222222 | 0 |
| 0.9979166666666667 | 0 |
| 0.998611111111111 | 0 |
| 0.9993055555555556 | 0 |